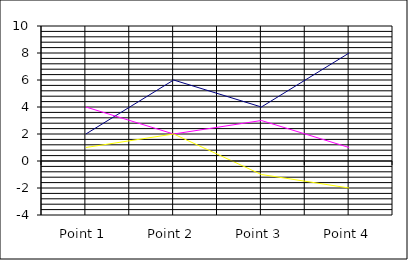
| Category | Series 1 | Series 2 | Series 3 |
|---|---|---|---|
| Point 1 | 2 | 4 | 1 |
| Point 2 | 6 | 2 | 2 |
| Point 3 | 4 | 3 | -1 |
| Point 4 | 8 | 1 | -2 |